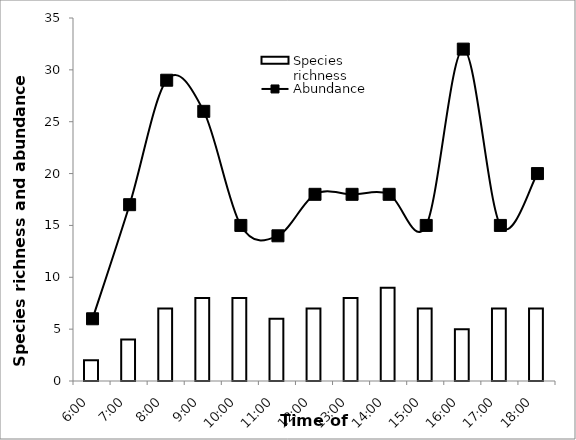
| Category | Species richness |
|---|---|
| 6:00 | 2 |
| 7:00 | 4 |
| 8:00 | 7 |
| 9:00 | 8 |
| 10:00 | 8 |
| 11:00 | 6 |
| 12:00 | 7 |
| 13:00 | 8 |
| 14:00 | 9 |
| 15:00 | 7 |
| 16:00 | 5 |
| 17:00 | 7 |
| 18:00 | 7 |